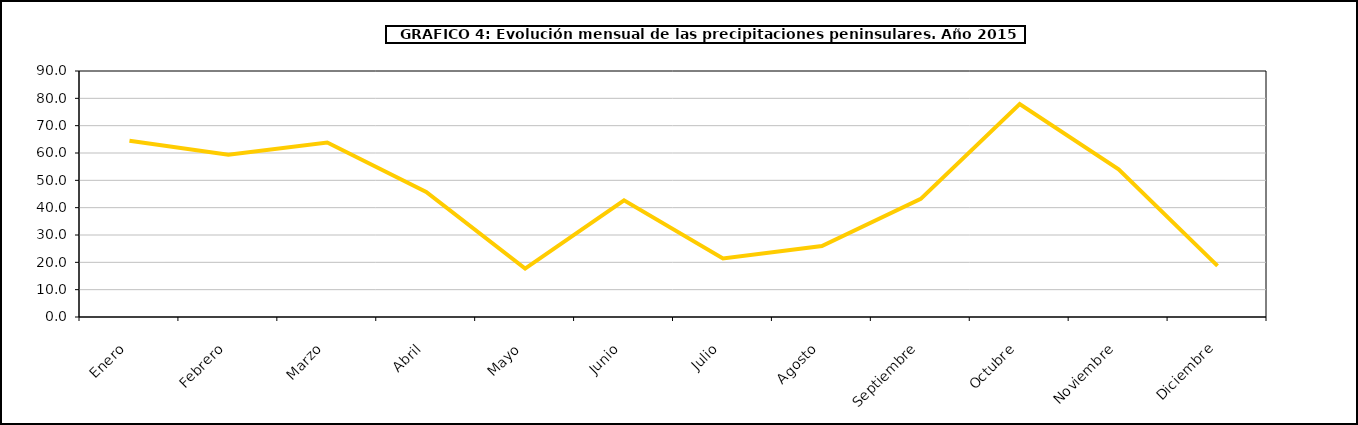
| Category | peninsula |
|---|---|
|  Enero | 64.509 |
|  Febrero | 59.325 |
|  Marzo | 63.863 |
|  Abril | 45.782 |
|  Mayo | 17.693 |
|  Junio | 42.695 |
|  Julio | 21.399 |
|  Agosto | 25.974 |
|  Septiembre | 43.209 |
|  Octubre | 77.869 |
|  Noviembre | 54.058 |
|  Diciembre | 18.703 |